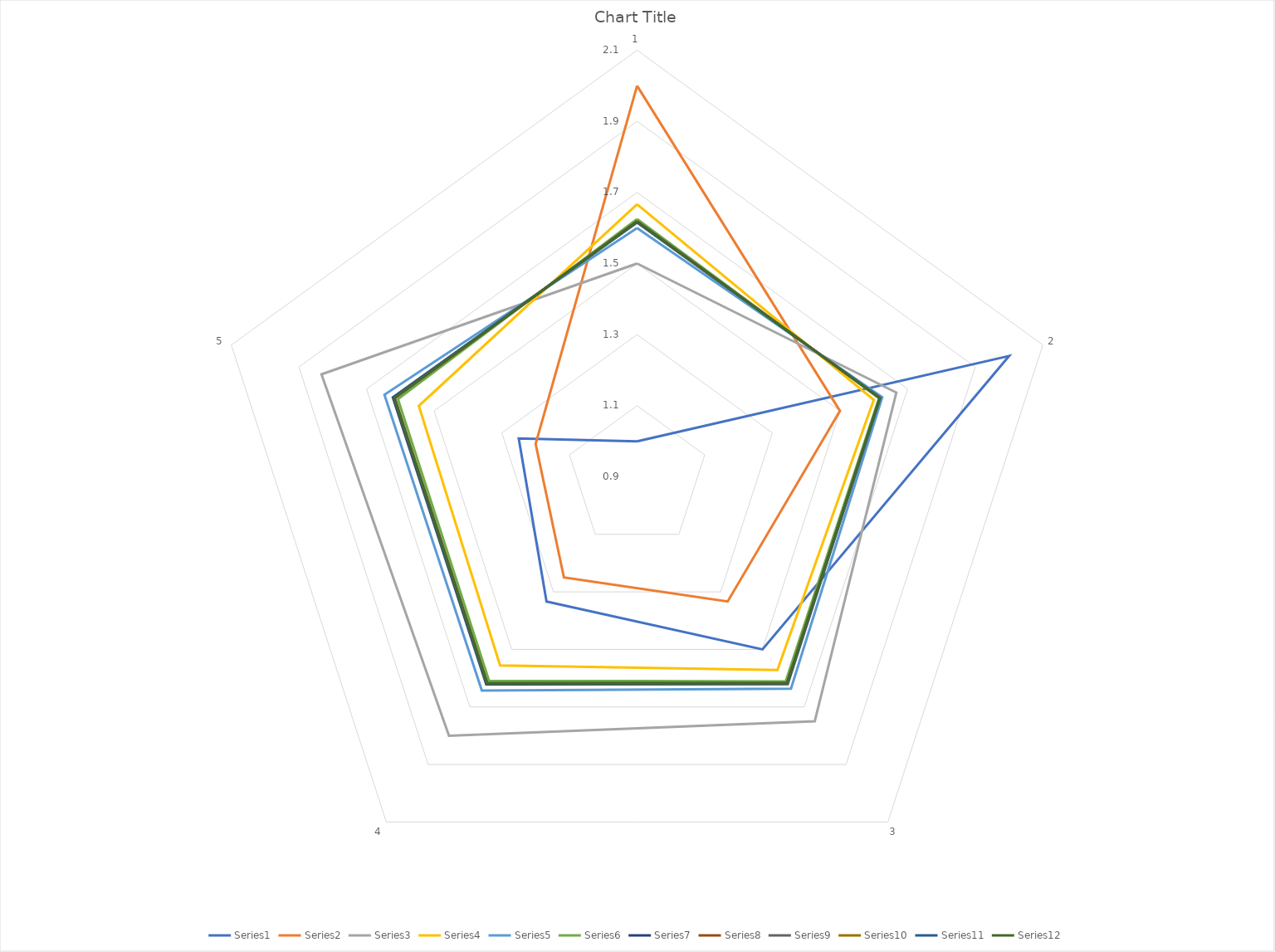
| Category | Series 0 | Series 1 | Series 2 | Series 3 | Series 4 | Series 5 | Series 6 | Series 7 | Series 8 | Series 9 | Series 10 | Series 11 |
|---|---|---|---|---|---|---|---|---|---|---|---|---|
| 0 | 1 | 2 | 1.5 | 1.667 | 1.6 | 1.625 | 1.615 | 1.619 | 1.618 | 1.618 | 1.618 | 1.618 |
| 1 | 2 | 1.5 | 1.667 | 1.6 | 1.625 | 1.615 | 1.619 | 1.618 | 1.618 | 1.618 | 1.618 | 1.618 |
| 2 | 1.5 | 1.333 | 1.75 | 1.571 | 1.636 | 1.611 | 1.621 | 1.617 | 1.618 | 1.618 | 1.618 | 1.618 |
| 3 | 1.333 | 1.25 | 1.8 | 1.556 | 1.643 | 1.609 | 1.622 | 1.617 | 1.619 | 1.618 | 1.618 | 1.618 |
| 4 | 1.25 | 1.2 | 1.833 | 1.545 | 1.647 | 1.607 | 1.622 | 1.616 | 1.619 | 1.618 | 1.618 | 1.618 |